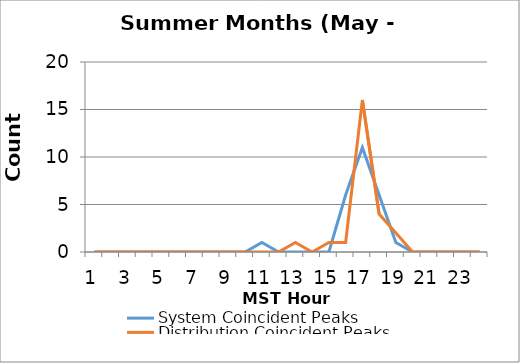
| Category | System Coincident Peaks | Distribution Coincident Peaks |
|---|---|---|
| 0 | 0 | 0 |
| 1 | 0 | 0 |
| 2 | 0 | 0 |
| 3 | 0 | 0 |
| 4 | 0 | 0 |
| 5 | 0 | 0 |
| 6 | 0 | 0 |
| 7 | 0 | 0 |
| 8 | 0 | 0 |
| 9 | 0 | 0 |
| 10 | 1 | 0 |
| 11 | 0 | 0 |
| 12 | 0 | 1 |
| 13 | 0 | 0 |
| 14 | 0 | 1 |
| 15 | 6 | 1 |
| 16 | 11 | 16 |
| 17 | 6 | 4 |
| 18 | 1 | 2 |
| 19 | 0 | 0 |
| 20 | 0 | 0 |
| 21 | 0 | 0 |
| 22 | 0 | 0 |
| 23 | 0 | 0 |